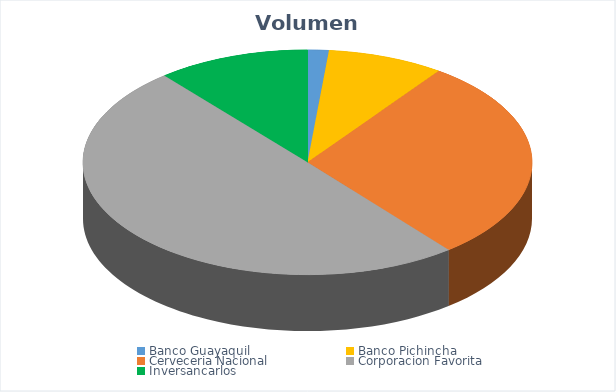
| Category | VOLUMEN ($USD) |
|---|---|
| Banco Guayaquil | 716.83 |
| Banco Pichincha | 3960 |
| Cerveceria Nacional | 13800 |
| Corporacion Favorita | 23494.89 |
| Inversancarlos | 5175.45 |